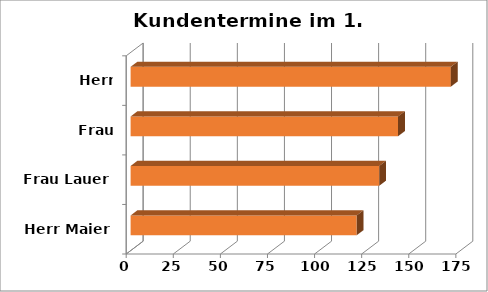
| Category | Kundentermine im 1. Quartal |
|---|---|
| Herr Maier | 120 |
| Frau Lauer | 132 |
| Frau Wieland | 142 |
| Herr Schmitt | 170 |